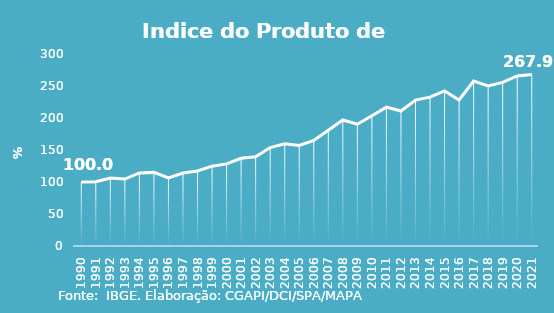
| Category | Indice de Prod. base 1990 |
|---|---|
| 1990.0 | 100 |
| 1991.0 | 100.275 |
| 1992.0 | 106.203 |
| 1993.0 | 104.57 |
| 1994.0 | 114.164 |
| 1995.0 | 115.024 |
| 1996.0 | 106.552 |
| 1997.0 | 114.037 |
| 1998.0 | 117.319 |
| 1999.0 | 124.734 |
| 2000.0 | 128.293 |
| 2001.0 | 136.975 |
| 2002.0 | 139.51 |
| 2003.0 | 153.868 |
| 2004.0 | 159.641 |
| 2005.0 | 157.136 |
| 2006.0 | 164.858 |
| 2007.0 | 180.781 |
| 2008.0 | 196.91 |
| 2009.0 | 190.309 |
| 2010.0 | 203.581 |
| 2011.0 | 217.041 |
| 2012.0 | 210.932 |
| 2013.0 | 228.009 |
| 2014.0 | 232.562 |
| 2015.0 | 242.318 |
| 2016.0 | 228.239 |
| 2017.0 | 257.766 |
| 2018.0 | 250.124 |
| 2019.0 | 255.64 |
| 2020.0 | 265.702 |
| 2021.0 | 267.894 |